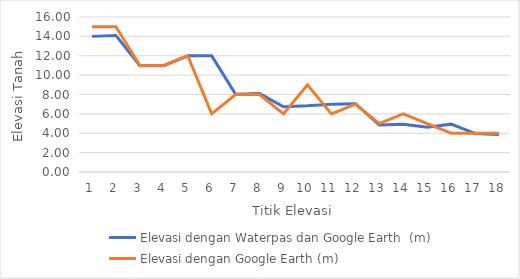
| Category | Elevasi dengan Waterpas dan Google Earth  (m) | Elevasi dengan Google Earth (m) |
|---|---|---|
| 0 | 14 | 15 |
| 1 | 14.1 | 15 |
| 2 | 10.96 | 11 |
| 3 | 10.97 | 11 |
| 4 | 11.99 | 12 |
| 5 | 11.99 | 6 |
| 6 | 8.03 | 8 |
| 7 | 8.09 | 8 |
| 8 | 6.73 | 6 |
| 9 | 6.83 | 9 |
| 10 | 6.99 | 6 |
| 11 | 7.05 | 7 |
| 12 | 4.86 | 5 |
| 13 | 4.92 | 6 |
| 14 | 4.62 | 5 |
| 15 | 4.94 | 4 |
| 16 | 3.98 | 4 |
| 17 | 3.88 | 4 |